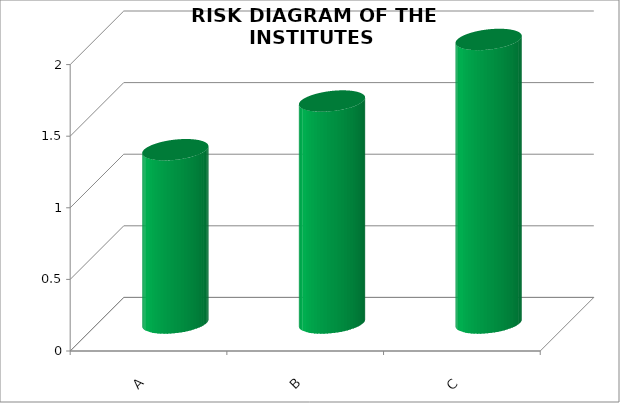
| Category | Series 1 |
|---|---|
| A | 1.21 |
| B | 1.55 |
| C | 1.98 |